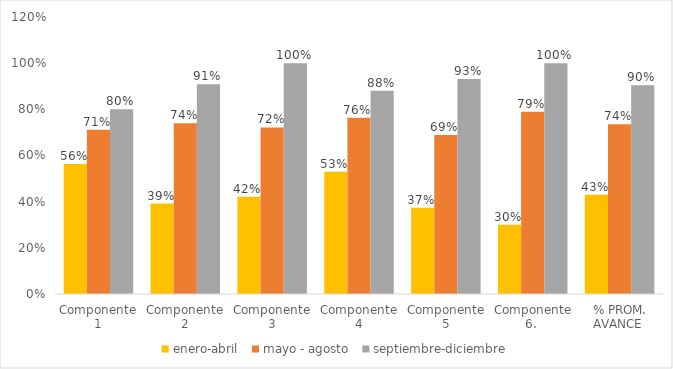
| Category | enero-abril  | mayo - agosto  | septiembre-diciembre |
|---|---|---|---|
| Componente 1 | 0.563 | 0.712 | 0.8 |
| Componente 2 | 0.392 | 0.74 | 0.908 |
| Componente 3 | 0.421 | 0.721 | 1 |
| Componente 4 | 0.53 | 0.763 | 0.88 |
| Componente 5 | 0.373 | 0.688 | 0.931 |
| Componente 6.  | 0.3 | 0.79 | 1 |
| % PROM. AVANCE  | 0.43 | 0.736 | 0.904 |